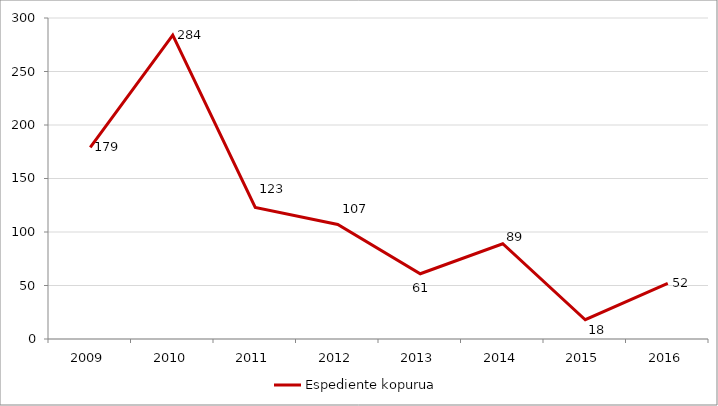
| Category | Espediente kopurua |
|---|---|
| 2009.0 | 179 |
| 2010.0 | 284 |
| 2011.0 | 123 |
| 2012.0 | 107 |
| 2013.0 | 61 |
| 2014.0 | 89 |
| 2015.0 | 18 |
| 2016.0 | 52 |